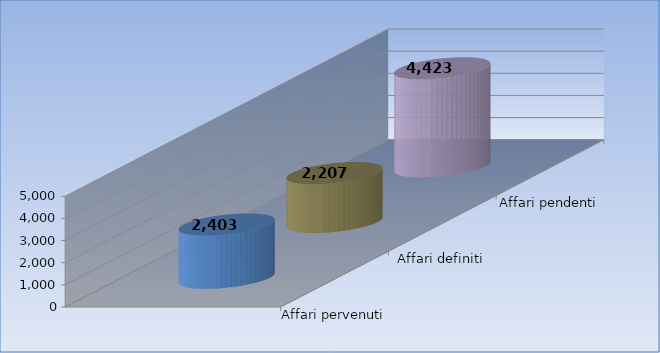
| Category | Affari pervenuti | Affari definiti | Affari pendenti |
|---|---|---|---|
| 0 | 2403 | 2207 | 4423 |